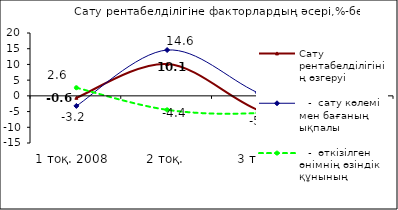
| Category | Сату рентабелділігінің өзгеруі |    -  сату көлемі мен бағаның ықпалы |    -  өткізілген өнімнің өзіндік құнының ықпалы |
|---|---|---|---|
| 1 тоқ. 2008  | -0.614 | -3.198 | 2.585 |
| 2 тоқ. | 10.135 | 14.582 | -4.446 |
| 3 тоқ. | -4.492 | 0.968 | -5.46 |
| 4 тоқ. | -13.352 | -11.699 | -1.653 |